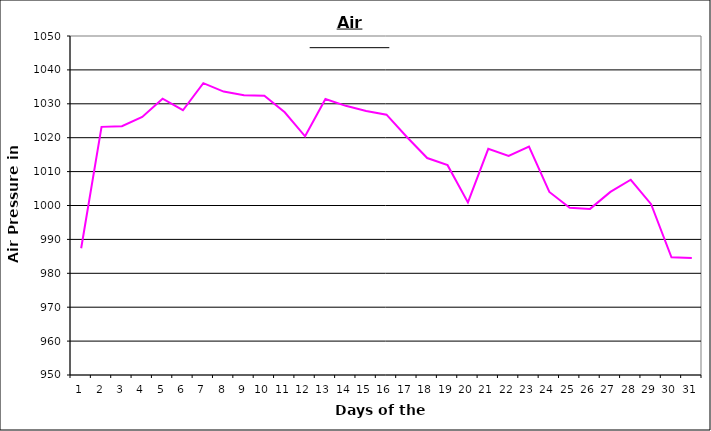
| Category | Series 0 |
|---|---|
| 0 | 987.4 |
| 1 | 1023.2 |
| 2 | 1023.4 |
| 3 | 1026.1 |
| 4 | 1031.5 |
| 5 | 1028.1 |
| 6 | 1036.1 |
| 7 | 1033.6 |
| 8 | 1032.5 |
| 9 | 1032.4 |
| 10 | 1027.5 |
| 11 | 1020.4 |
| 12 | 1031.4 |
| 13 | 1029.4 |
| 14 | 1027.9 |
| 15 | 1026.8 |
| 16 | 1020.2 |
| 17 | 1014 |
| 18 | 1011.9 |
| 19 | 1000.9 |
| 20 | 1016.7 |
| 21 | 1014.6 |
| 22 | 1017.4 |
| 23 | 1004 |
| 24 | 999.3 |
| 25 | 999 |
| 26 | 1004 |
| 27 | 1007.6 |
| 28 | 1000.4 |
| 29 | 984.7 |
| 30 | 984.5 |